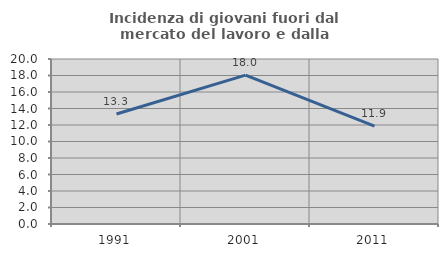
| Category | Incidenza di giovani fuori dal mercato del lavoro e dalla formazione  |
|---|---|
| 1991.0 | 13.333 |
| 2001.0 | 18.048 |
| 2011.0 | 11.868 |